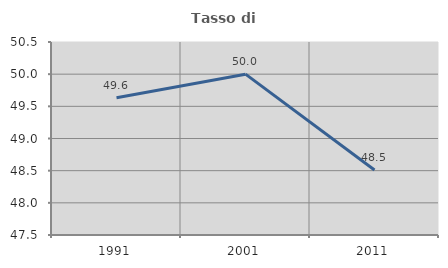
| Category | Tasso di occupazione   |
|---|---|
| 1991.0 | 49.633 |
| 2001.0 | 50 |
| 2011.0 | 48.509 |